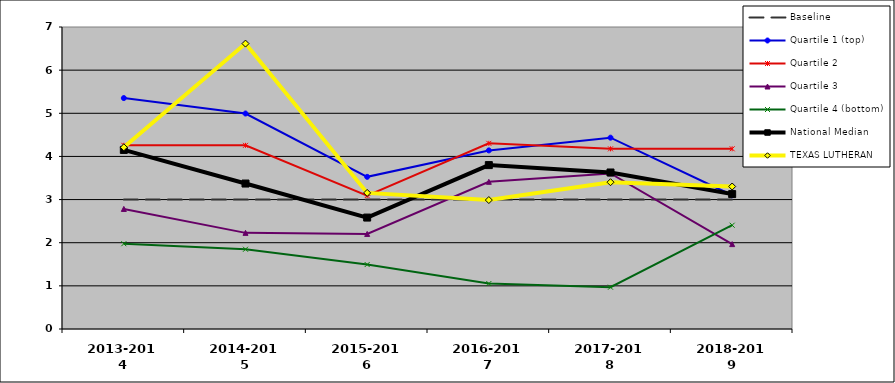
| Category | Baseline | Quartile 1 (top) | Quartile 2 | Quartile 3 | Quartile 4 (bottom) | National Median | TEXAS LUTHERAN |
|---|---|---|---|---|---|---|---|
| 2013-2014 | 3 | 5.353 | 4.258 | 2.783 | 1.977 | 4.151 | 4.212 |
| 2014-2015 | 3 | 4.995 | 4.257 | 2.228 | 1.848 | 3.372 | 6.615 |
| 2015-2016 | 3 | 3.527 | 3.091 | 2.204 | 1.494 | 2.583 | 3.155 |
| 2016-2017 | 3 | 4.14 | 4.303 | 3.412 | 1.053 | 3.799 | 2.989 |
| 2017-2018 | 3 | 4.435 | 4.176 | 3.606 | 0.969 | 3.628 | 3.403 |
| 2018-2019 | 3 | 3.1 | 4.177 | 1.968 | 2.405 | 3.127 | 3.303 |